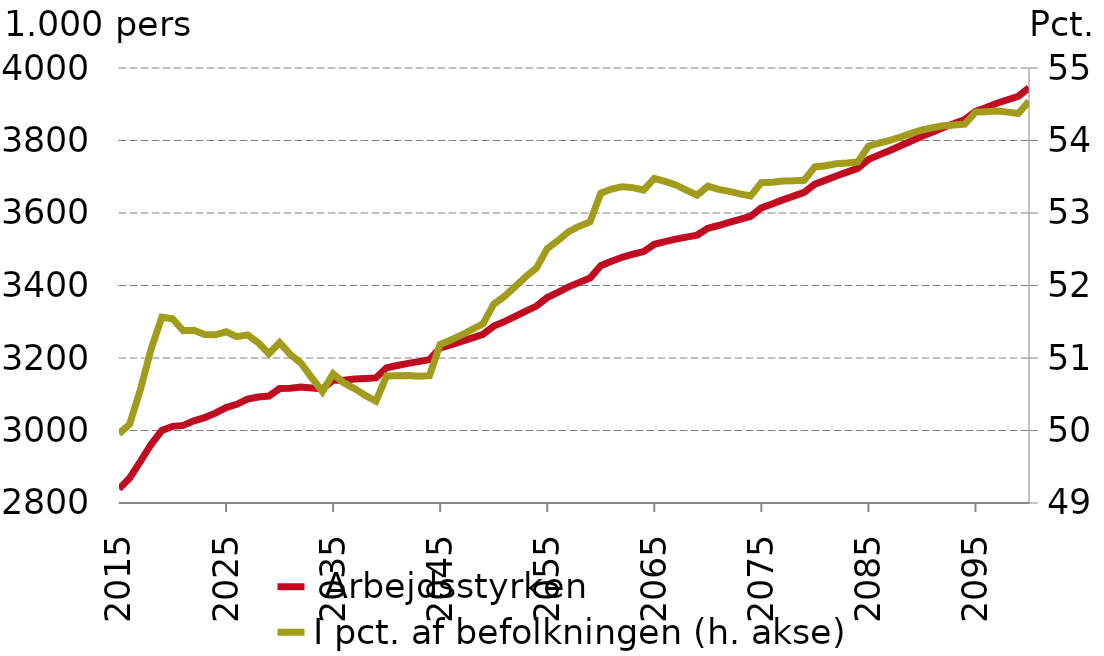
| Category |  Arbejdsstyrken |
|---|---|
| 2015-01-01 | 2838.931 |
| 2016-01-01 | 2868.944 |
| 2017-01-01 | 2914.8 |
| 2018-01-01 | 2961.829 |
| 2019-01-01 | 3000.017 |
| 2020-01-01 | 3011.395 |
| 2021-01-01 | 3013.995 |
| 2022-01-01 | 3026.701 |
| 2023-01-01 | 3035.641 |
| 2024-01-01 | 3047.908 |
| 2025-01-01 | 3063.252 |
| 2026-01-01 | 3072.235 |
| 2027-01-01 | 3086.464 |
| 2028-01-01 | 3092.44 |
| 2029-01-01 | 3095.082 |
| 2030-01-01 | 3115.792 |
| 2031-01-01 | 3116.854 |
| 2032-01-01 | 3119.678 |
| 2033-01-01 | 3117.334 |
| 2034-01-01 | 3114.616 |
| 2035-01-01 | 3138.478 |
| 2036-01-01 | 3138.935 |
| 2037-01-01 | 3141.801 |
| 2038-01-01 | 3143.191 |
| 2039-01-01 | 3145.114 |
| 2040-01-01 | 3173.054 |
| 2041-01-01 | 3179.324 |
| 2042-01-01 | 3185.214 |
| 2043-01-01 | 3189.893 |
| 2044-01-01 | 3195.464 |
| 2045-01-01 | 3227.745 |
| 2046-01-01 | 3236.462 |
| 2047-01-01 | 3245.722 |
| 2048-01-01 | 3255.697 |
| 2049-01-01 | 3265.473 |
| 2050-01-01 | 3287.922 |
| 2051-01-01 | 3300.189 |
| 2052-01-01 | 3314.553 |
| 2053-01-01 | 3329.333 |
| 2054-01-01 | 3343.187 |
| 2055-01-01 | 3366.939 |
| 2056-01-01 | 3380.944 |
| 2057-01-01 | 3396.174 |
| 2058-01-01 | 3408.639 |
| 2059-01-01 | 3420.423 |
| 2060-01-01 | 3454.428 |
| 2061-01-01 | 3466.814 |
| 2062-01-01 | 3477.89 |
| 2063-01-01 | 3486.254 |
| 2064-01-01 | 3493.583 |
| 2065-01-01 | 3513.725 |
| 2066-01-01 | 3521.01 |
| 2067-01-01 | 3527.936 |
| 2068-01-01 | 3533.37 |
| 2069-01-01 | 3539.104 |
| 2070-01-01 | 3557.859 |
| 2071-01-01 | 3565.488 |
| 2072-01-01 | 3574.34 |
| 2073-01-01 | 3582.556 |
| 2074-01-01 | 3591.13 |
| 2075-01-01 | 3613.949 |
| 2076-01-01 | 3624.728 |
| 2077-01-01 | 3636.163 |
| 2078-01-01 | 3646.512 |
| 2079-01-01 | 3657.135 |
| 2080-01-01 | 3679.703 |
| 2081-01-01 | 3690.714 |
| 2082-01-01 | 3702.258 |
| 2083-01-01 | 3712.671 |
| 2084-01-01 | 3723.271 |
| 2085-01-01 | 3747.771 |
| 2086-01-01 | 3760.273 |
| 2087-01-01 | 3772.55 |
| 2088-01-01 | 3785.368 |
| 2089-01-01 | 3798.558 |
| 2090-01-01 | 3811.628 |
| 2091-01-01 | 3823.669 |
| 2092-01-01 | 3835.739 |
| 2093-01-01 | 3846.764 |
| 2094-01-01 | 3857.829 |
| 2095-01-01 | 3880.249 |
| 2096-01-01 | 3891.272 |
| 2097-01-01 | 3902.613 |
| 2098-01-01 | 3912.474 |
| 2099-01-01 | 3921.974 |
| 2100-01-01 | 3945.303 |